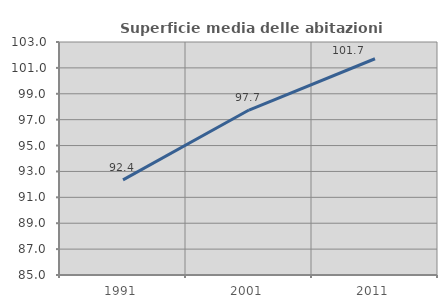
| Category | Superficie media delle abitazioni occupate |
|---|---|
| 1991.0 | 92.352 |
| 2001.0 | 97.745 |
| 2011.0 | 101.705 |